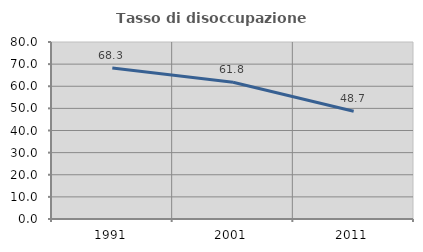
| Category | Tasso di disoccupazione giovanile  |
|---|---|
| 1991.0 | 68.259 |
| 2001.0 | 61.771 |
| 2011.0 | 48.711 |